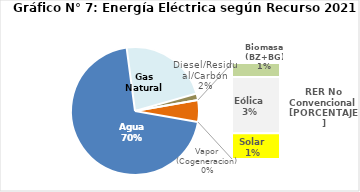
| Category | Series 0 |
|---|---|
| Agua | 3447.778 |
| Gas Natural | 1114.515 |
| Diesel/Residual/Carbón | 81.295 |
| Vapor (Cogeneracion) | 0.327 |
| Biomasa (BZ+BG) | 39.467 |
| Eólica | 159.173 |
| Solar | 72.948 |